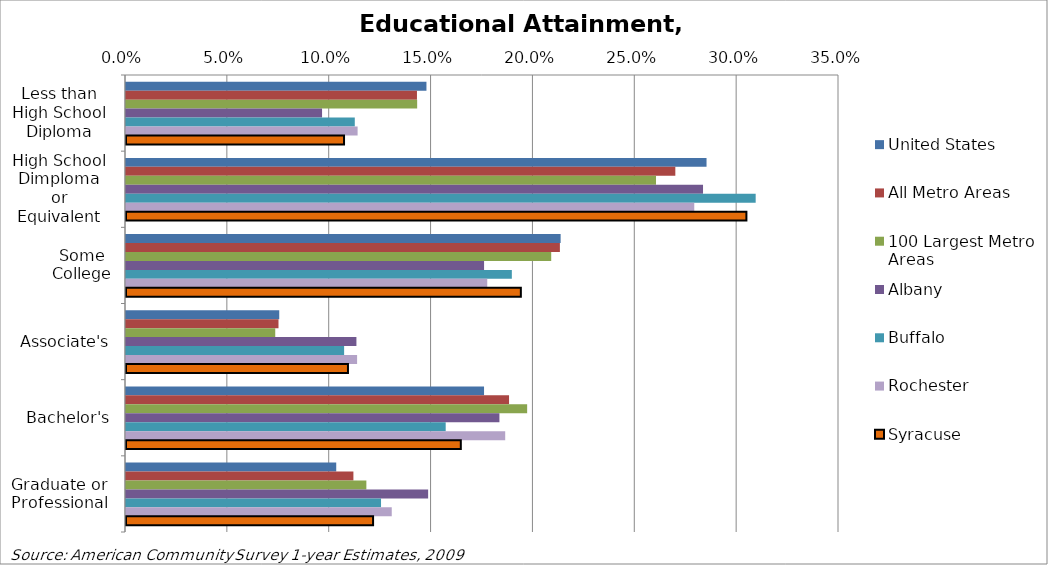
| Category | United States | All Metro Areas | 100 Largest Metro Areas | Albany | Buffalo | Rochester | Syracuse |
|---|---|---|---|---|---|---|---|
| Less than
High School
Diploma | 0.147 | 0.143 | 0.143 | 0.096 | 0.112 | 0.114 | 0.107 |
| High School
Dimploma
or
Equivalent | 0.285 | 0.27 | 0.26 | 0.283 | 0.309 | 0.279 | 0.305 |
| Some
College | 0.213 | 0.213 | 0.209 | 0.176 | 0.189 | 0.177 | 0.194 |
| Associate's | 0.075 | 0.075 | 0.073 | 0.113 | 0.107 | 0.113 | 0.109 |
| Bachelor's | 0.176 | 0.188 | 0.197 | 0.183 | 0.157 | 0.186 | 0.164 |
| Graduate or
Professional | 0.103 | 0.112 | 0.118 | 0.148 | 0.125 | 0.13 | 0.121 |